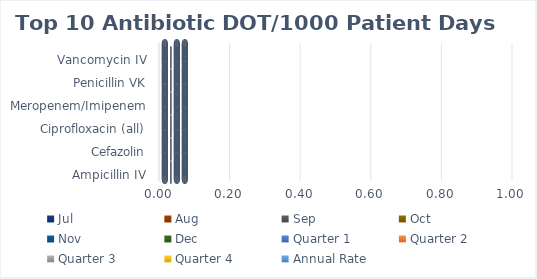
| Category | Jul | Aug | Sep | Oct | Nov | Dec | Quarter 1 | Quarter 2 | Quarter 3 | Quarter 4 | Annual Rate |
|---|---|---|---|---|---|---|---|---|---|---|---|
| Ampicillin IV | 0 | 0 | 0 | 0 | 0 | 0 | 0 | 0 | 0 | 0 | 0 |
| Azithromycin (all) | 0 | 0 | 0 | 0 | 0 | 0 | 0 | 0 | 0 | 0 | 0 |
| Cefazolin | 0 | 0 | 0 | 0 | 0 | 0 | 0 | 0 | 0 | 0 | 0 |
| Ceftriaxone | 0 | 0 | 0 | 0 | 0 | 0 | 0 | 0 | 0 | 0 | 0 |
| Ciprofloxacin (all) | 0 | 0 | 0 | 0 | 0 | 0 | 0 | 0 | 0 | 0 | 0 |
| Levofloxacin (all) | 0 | 0 | 0 | 0 | 0 | 0 | 0 | 0 | 0 | 0 | 0 |
| Meropenem/Imipenem | 0 | 0 | 0 | 0 | 0 | 0 | 0 | 0 | 0 | 0 | 0 |
| Nitrofurantoin | 0 | 0 | 0 | 0 | 0 | 0 | 0 | 0 | 0 | 0 | 0 |
| Penicillin VK | 0 | 0 | 0 | 0 | 0 | 0 | 0 | 0 | 0 | 0 | 0 |
| Valacyclovir | 0 | 0 | 0 | 0 | 0 | 0 | 0 | 0 | 0 | 0 | 0 |
| Vancomycin IV | 0 | 0 | 0 | 0 | 0 | 0 | 0 | 0 | 0 | 0 | 0 |
| Vancomycin PO | 0 | 0 | 0 | 0 | 0 | 0 | 0 | 0 | 0 | 0 | 0 |